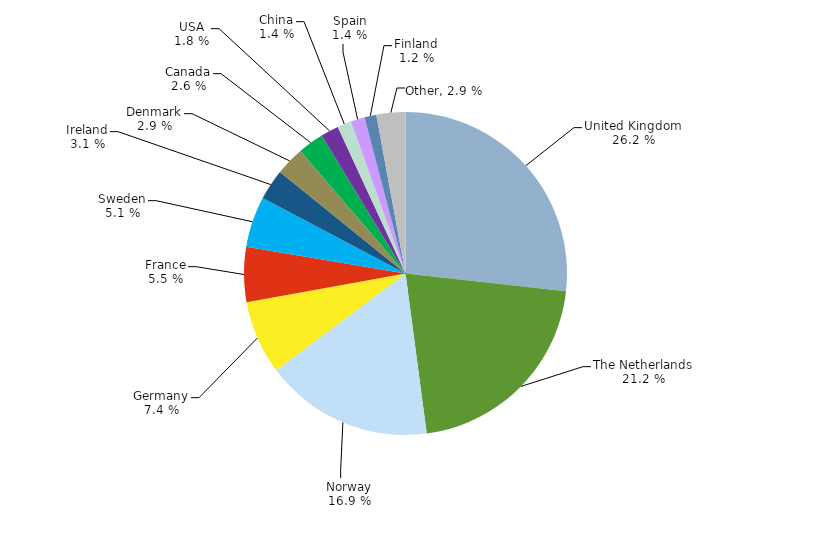
| Category | Series 0 |
|---|---|
| United Kingdom | 0.268 |
| The Netherlands | 0.212 |
| Norway | 0.169 |
| Germany | 0.074 |
| France | 0.055 |
| Sweden | 0.051 |
| Ireland | 0.031 |
| Denmark | 0.029 |
| Canada | 0.026 |
| USA | 0.018 |
| China | 0.014 |
| Spain | 0.014 |
| Finland | 0.012 |
| Other | 0.029 |